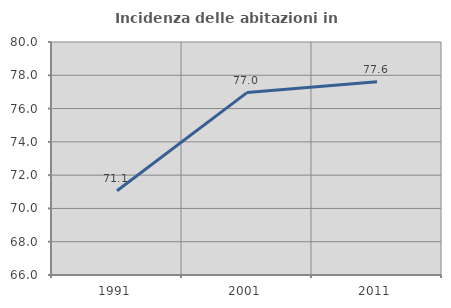
| Category | Incidenza delle abitazioni in proprietà  |
|---|---|
| 1991.0 | 71.065 |
| 2001.0 | 76.96 |
| 2011.0 | 77.616 |